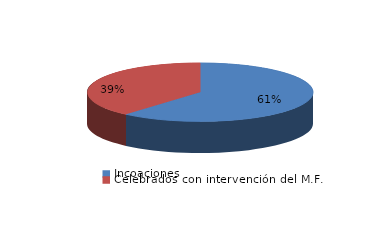
| Category | Series 0 |
|---|---|
| Incoaciones | 2195 |
| Celebrados con intervención del M.F. | 1383 |